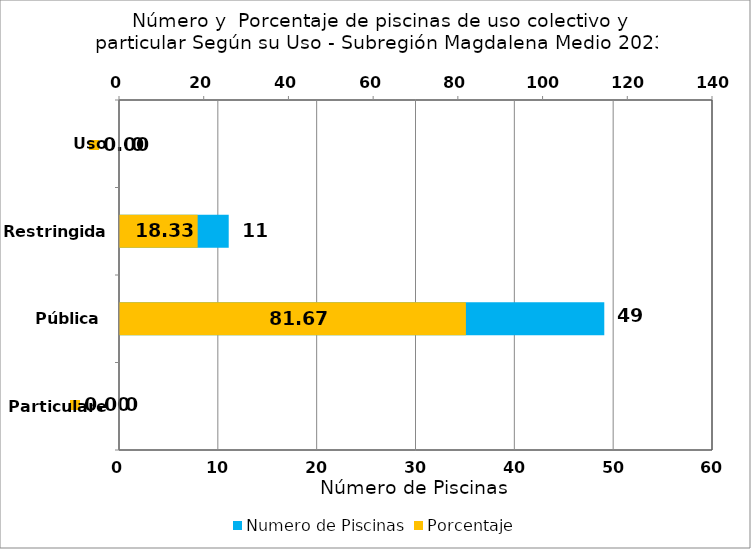
| Category | Numero de Piscinas |
|---|---|
| Particulares | 0 |
| Pública | 49 |
| Restringida | 11 |
| Uso Especial | 0 |